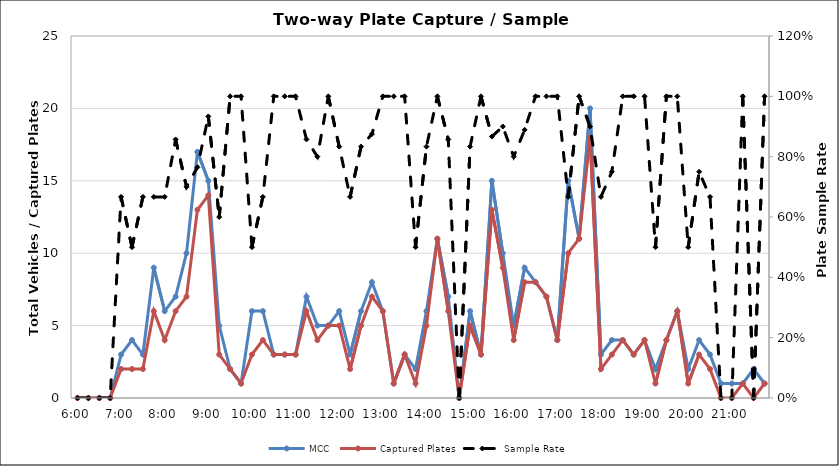
| Category | MCC | Captured Plates |
|---|---|---|
| 0.25 | 0 | 0 |
| 0.260416666666667 | 0 | 0 |
| 0.270833333333333 | 0 | 0 |
| 0.28125 | 0 | 0 |
| 0.291666666666667 | 3 | 2 |
| 0.302083333333333 | 4 | 2 |
| 0.3125 | 3 | 2 |
| 0.322916666666667 | 9 | 6 |
| 0.333333333333333 | 6 | 4 |
| 0.34375 | 7 | 6 |
| 0.354166666666667 | 10 | 7 |
| 0.364583333333333 | 17 | 13 |
| 0.375 | 15 | 14 |
| 0.385416666666667 | 5 | 3 |
| 0.395833333333333 | 2 | 2 |
| 0.40625 | 1 | 1 |
| 0.416666666666667 | 6 | 3 |
| 0.427083333333333 | 6 | 4 |
| 0.4375 | 3 | 3 |
| 0.447916666666667 | 3 | 3 |
| 0.458333333333333 | 3 | 3 |
| 0.46875 | 7 | 6 |
| 0.479166666666667 | 5 | 4 |
| 0.489583333333333 | 5 | 5 |
| 0.5 | 6 | 5 |
| 0.510416666666667 | 3 | 2 |
| 0.520833333333333 | 6 | 5 |
| 0.53125 | 8 | 7 |
| 0.541666666666667 | 6 | 6 |
| 0.552083333333333 | 1 | 1 |
| 0.5625 | 3 | 3 |
| 0.572916666666667 | 2 | 1 |
| 0.583333333333333 | 6 | 5 |
| 0.59375 | 11 | 11 |
| 0.604166666666667 | 7 | 6 |
| 0.614583333333333 | 0 | 0 |
| 0.625 | 6 | 5 |
| 0.635416666666667 | 3 | 3 |
| 0.645833333333333 | 15 | 13 |
| 0.65625 | 10 | 9 |
| 0.666666666666667 | 5 | 4 |
| 0.677083333333333 | 9 | 8 |
| 0.6875 | 8 | 8 |
| 0.697916666666667 | 7 | 7 |
| 0.708333333333333 | 4 | 4 |
| 0.71875 | 15 | 10 |
| 0.729166666666667 | 11 | 11 |
| 0.739583333333333 | 20 | 18 |
| 0.75 | 3 | 2 |
| 0.760416666666667 | 4 | 3 |
| 0.770833333333333 | 4 | 4 |
| 0.78125 | 3 | 3 |
| 0.791666666666667 | 4 | 4 |
| 0.802083333333333 | 2 | 1 |
| 0.8125 | 4 | 4 |
| 0.822916666666667 | 6 | 6 |
| 0.833333333333333 | 2 | 1 |
| 0.84375 | 4 | 3 |
| 0.854166666666667 | 3 | 2 |
| 0.864583333333333 | 1 | 0 |
| 0.875 | 1 | 0 |
| 0.885416666666667 | 1 | 1 |
| 0.895833333333333 | 2 | 0 |
| 0.90625 | 1 | 1 |